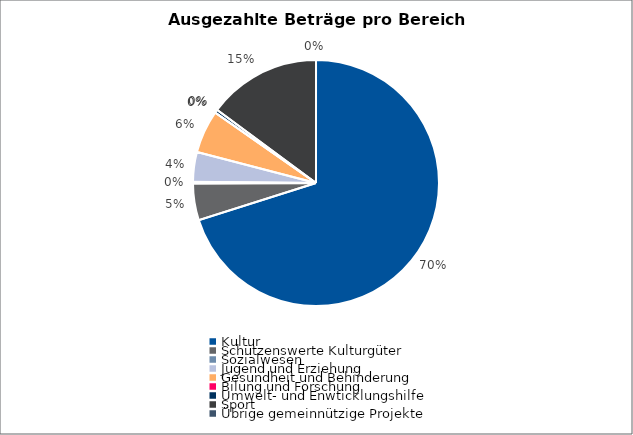
| Category | Series 0 |
|---|---|
| Kultur | 799514.65 |
| Schützenswerte Kulturgüter | 54997 |
| Sozialwesen | 2600 |
| Jugend und Erziehung | 44214.1 |
| Gesundheit und Behinderung | 64528.05 |
| Bilung und Forschung | 0 |
| Umwelt- und Enwticklungshilfe | 4850 |
| Sport | 169595.2 |
| Übrige gemeinnützige Projekte | 0 |